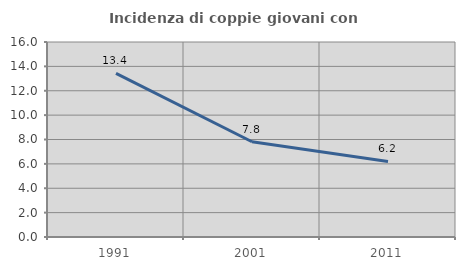
| Category | Incidenza di coppie giovani con figli |
|---|---|
| 1991.0 | 13.42 |
| 2001.0 | 7.816 |
| 2011.0 | 6.202 |